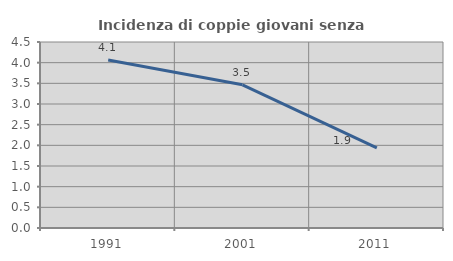
| Category | Incidenza di coppie giovani senza figli |
|---|---|
| 1991.0 | 4.065 |
| 2001.0 | 3.465 |
| 2011.0 | 1.939 |